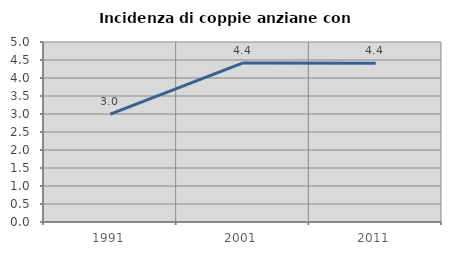
| Category | Incidenza di coppie anziane con figli |
|---|---|
| 1991.0 | 2.998 |
| 2001.0 | 4.418 |
| 2011.0 | 4.411 |